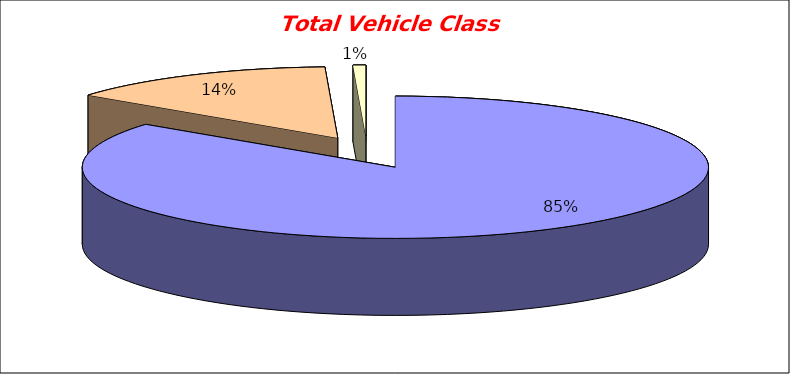
| Category | Series 0 |
|---|---|
| 0 | 3862.571 |
| 1 | 635.571 |
| 2 | 29.714 |